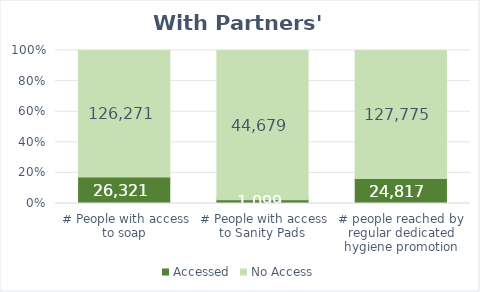
| Category | Accessed | No Access |
|---|---|---|
|  # People with access to soap | 26321 | 126271 |
|  # People with access to Sanity Pads | 1099 | 44678.6 |
| # people reached by regular dedicated hygiene promotion | 24817 | 127775 |